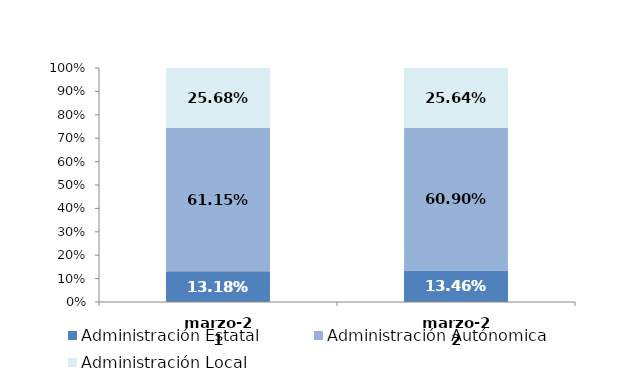
| Category | Administración Estatal | Administración Autónomica | Administración Local |
|---|---|---|---|
| 2021-03-01 | 0.132 | 0.611 | 0.257 |
| 2022-03-01 | 0.135 | 0.609 | 0.256 |